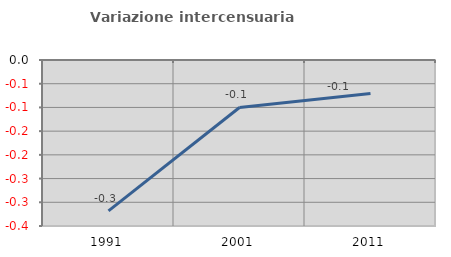
| Category | Variazione intercensuaria annua |
|---|---|
| 1991.0 | -0.318 |
| 2001.0 | -0.1 |
| 2011.0 | -0.071 |